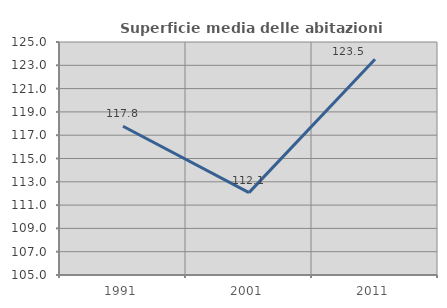
| Category | Superficie media delle abitazioni occupate |
|---|---|
| 1991.0 | 117.766 |
| 2001.0 | 112.073 |
| 2011.0 | 123.519 |